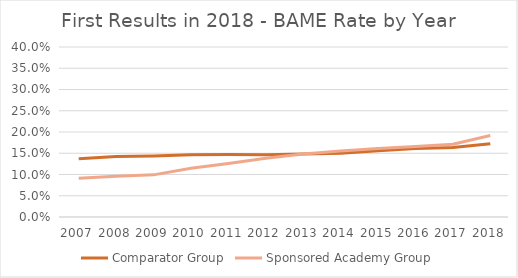
| Category | Comparator Group | Sponsored Academy Group |
|---|---|---|
| 2007.0 | 0.137 | 0.091 |
| 2008.0 | 0.142 | 0.096 |
| 2009.0 | 0.144 | 0.099 |
| 2010.0 | 0.146 | 0.115 |
| 2011.0 | 0.147 | 0.126 |
| 2012.0 | 0.147 | 0.138 |
| 2013.0 | 0.148 | 0.148 |
| 2014.0 | 0.15 | 0.155 |
| 2015.0 | 0.156 | 0.161 |
| 2016.0 | 0.161 | 0.166 |
| 2017.0 | 0.163 | 0.171 |
| 2018.0 | 0.173 | 0.192 |